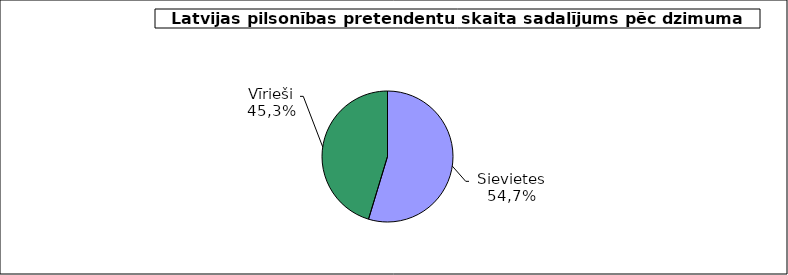
| Category | Series 0 |
|---|---|
|              Sievietes | 0.547 |
|              Vīrieši | 0.453 |